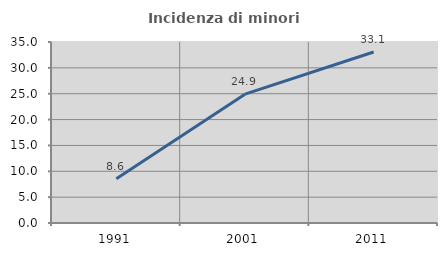
| Category | Incidenza di minori stranieri |
|---|---|
| 1991.0 | 8.571 |
| 2001.0 | 24.916 |
| 2011.0 | 33.065 |